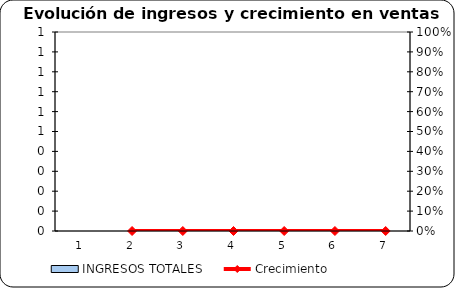
| Category | INGRESOS TOTALES |
|---|---|
| 1.0 | 0 |
| 2.0 | 0 |
| 3.0 | 0 |
| 4.0 | 0 |
| 5.0 | 0 |
| 6.0 | 0 |
| 7.0 | 0 |